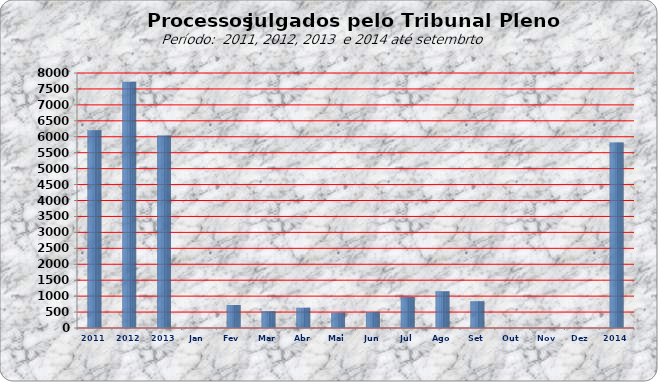
| Category | 6205 7722 6043 0 721 524 638 481 496 969 1152 842 0 0 0 |
|---|---|
| 2011 | 6205 |
| 2012 | 7722 |
| 2013 | 6043 |
| Jan | 0 |
| Fev | 721 |
| Mar | 524 |
| Abr | 638 |
| Mai | 481 |
| Jun | 496 |
| Jul | 969 |
| Ago | 1152 |
| Set | 842 |
| Out | 0 |
| Nov | 0 |
| Dez | 0 |
| 2014 | 5823 |